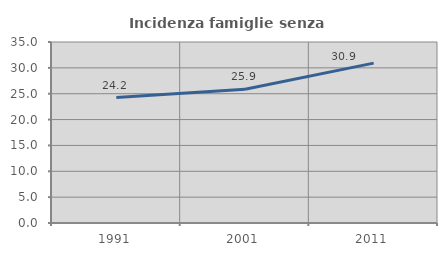
| Category | Incidenza famiglie senza nuclei |
|---|---|
| 1991.0 | 24.245 |
| 2001.0 | 25.861 |
| 2011.0 | 30.916 |